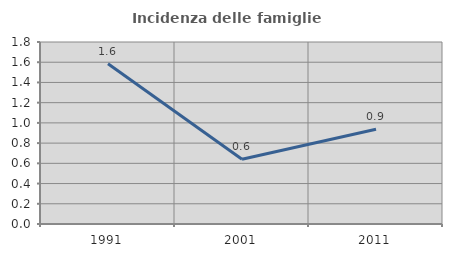
| Category | Incidenza delle famiglie numerose |
|---|---|
| 1991.0 | 1.584 |
| 2001.0 | 0.64 |
| 2011.0 | 0.937 |